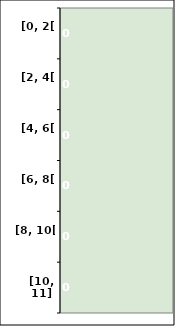
| Category | Series 0 |
|---|---|
| [0, 2[ | 0 |
| [2, 4[ | 0 |
| [4, 6[ | 0 |
| [6, 8[ | 0 |
| [8, 10[ | 0 |
| [10, 11] | 0 |